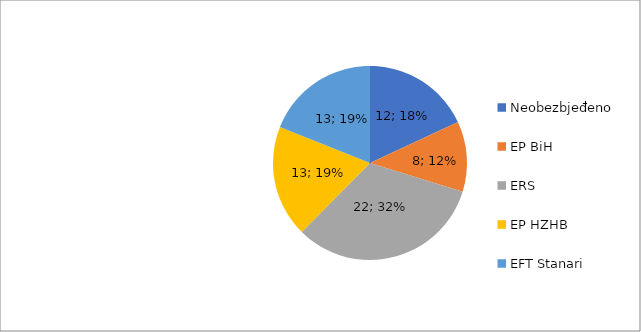
| Category | TR Nadole |
|---|---|
| Neobezbjeđeno | 12.389 |
| EP BiH | 8.057 |
| ERS | 22.404 |
| EP HZHB | 12.8 |
| EFT Stanari | 13 |